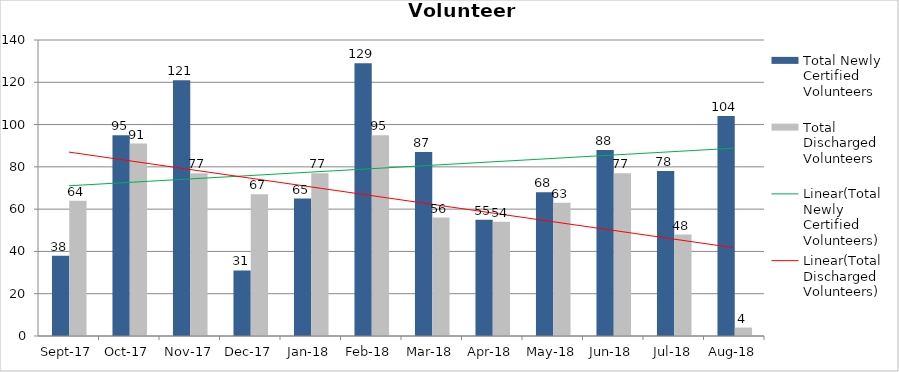
| Category | Total Newly Certified Volunteers | Total Discharged Volunteers |
|---|---|---|
| 2017-09-01 | 38 | 64 |
| 2017-10-01 | 95 | 91 |
| 2017-11-01 | 121 | 77 |
| 2017-12-01 | 31 | 67 |
| 2018-01-01 | 65 | 77 |
| 2018-02-01 | 129 | 95 |
| 2018-03-01 | 87 | 56 |
| 2018-04-01 | 55 | 54 |
| 2018-05-01 | 68 | 63 |
| 2018-06-01 | 88 | 77 |
| 2018-07-01 | 78 | 48 |
| 2018-08-01 | 104 | 4 |